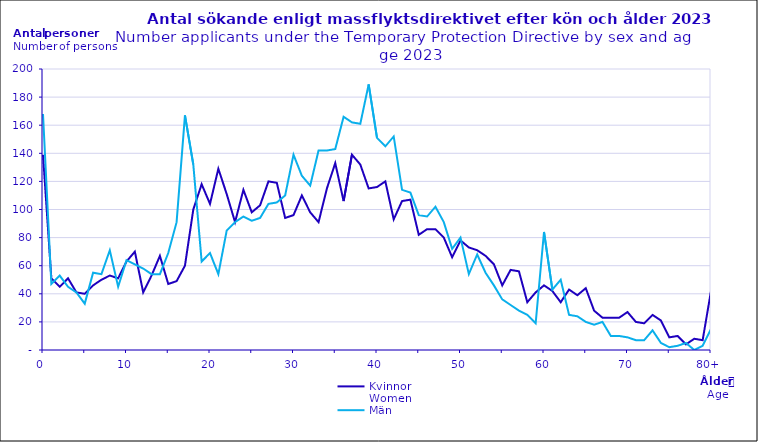
| Category | Kvinnor
Women | Män
Men |
|---|---|---|
| 0 | 139 | 168 |
| 1 | 51 | 47 |
| 2 | 45 | 53 |
| 3 | 51 | 45 |
| 4 | 41 | 41 |
| 5 | 40 | 33 |
| 6 | 46 | 55 |
| 7 | 50 | 54 |
| 8 | 53 | 71 |
| 9 | 51 | 45 |
| 10 | 63 | 64 |
| 11 | 70 | 61 |
| 12 | 41 | 58 |
| 13 | 53 | 54 |
| 14 | 67 | 54 |
| 15 | 47 | 69 |
| 16 | 49 | 91 |
| 17 | 60 | 167 |
| 18 | 100 | 132 |
| 19 | 118 | 63 |
| 20 | 104 | 69 |
| 21 | 129 | 54 |
| 22 | 111 | 85 |
| 23 | 91 | 91 |
| 24 | 114 | 95 |
| 25 | 98 | 92 |
| 26 | 103 | 94 |
| 27 | 120 | 104 |
| 28 | 119 | 105 |
| 29 | 94 | 110 |
| 30 | 96 | 139 |
| 31 | 110 | 124 |
| 32 | 98 | 117 |
| 33 | 91 | 142 |
| 34 | 115 | 142 |
| 35 | 133 | 143 |
| 36 | 106 | 166 |
| 37 | 139 | 162 |
| 38 | 132 | 161 |
| 39 | 115 | 189 |
| 40 | 116 | 151 |
| 41 | 120 | 145 |
| 42 | 93 | 152 |
| 43 | 106 | 114 |
| 44 | 107 | 112 |
| 45 | 82 | 96 |
| 46 | 86 | 95 |
| 47 | 86 | 102 |
| 48 | 80 | 91 |
| 49 | 66 | 72 |
| 50 | 78 | 80 |
| 51 | 73 | 54 |
| 52 | 71 | 68 |
| 53 | 67 | 55 |
| 54 | 61 | 46 |
| 55 | 46 | 36 |
| 56 | 57 | 32 |
| 57 | 56 | 28 |
| 58 | 34 | 25 |
| 59 | 41 | 19 |
| 60 | 46 | 84 |
| 61 | 42 | 43 |
| 62 | 34 | 50 |
| 63 | 43 | 25 |
| 64 | 39 | 24 |
| 65 | 44 | 20 |
| 66 | 28 | 18 |
| 67 | 23 | 20 |
| 68 | 23 | 10 |
| 69 | 23 | 10 |
| 70 | 27 | 9 |
| 71 | 20 | 7 |
| 72 | 19 | 7 |
| 73 | 25 | 14 |
| 74 | 21 | 5 |
| 75 | 9 | 2 |
| 76 | 10 | 3 |
| 77 | 4 | 5 |
| 78 | 8 | 0 |
| 79 | 7 | 3 |
| 80+ | 42 | 15 |